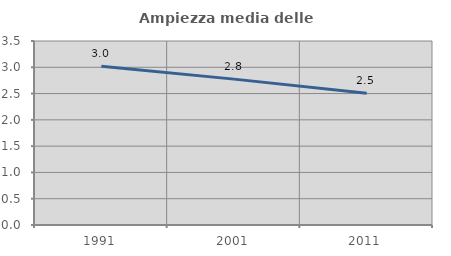
| Category | Ampiezza media delle famiglie |
|---|---|
| 1991.0 | 3.021 |
| 2001.0 | 2.775 |
| 2011.0 | 2.506 |